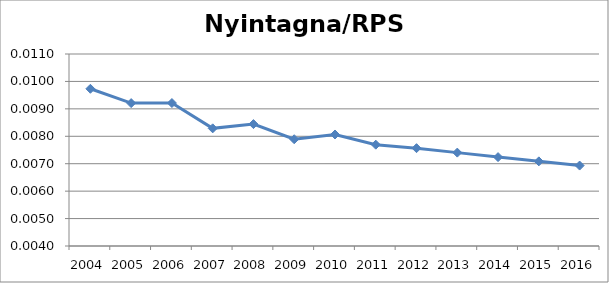
| Category | Nyintagna/RPS in  |
|---|---|
| 2004.0 | 0.01 |
| 2005.0 | 0.009 |
| 2006.0 | 0.009 |
| 2007.0 | 0.008 |
| 2008.0 | 0.008 |
| 2009.0 | 0.008 |
| 2010.0 | 0.008 |
| 2011.0 | 0.008 |
| 2012.0 | 0.008 |
| 2013.0 | 0.007 |
| 2014.0 | 0.007 |
| 2015.0 | 0.007 |
| 2016.0 | 0.007 |